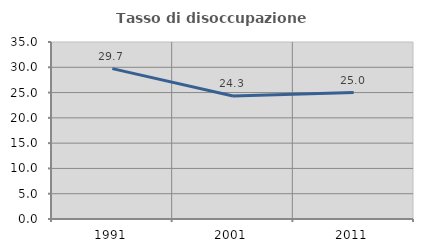
| Category | Tasso di disoccupazione giovanile  |
|---|---|
| 1991.0 | 29.73 |
| 2001.0 | 24.324 |
| 2011.0 | 25 |